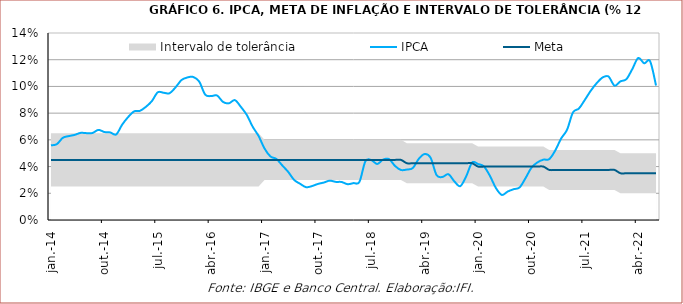
| Category | IPCA | Meta |
|---|---|---|
| 2014-01-01 | 0.056 | 0.045 |
| 2014-02-01 | 0.057 | 0.045 |
| 2014-03-01 | 0.062 | 0.045 |
| 2014-04-01 | 0.063 | 0.045 |
| 2014-05-01 | 0.064 | 0.045 |
| 2014-06-01 | 0.065 | 0.045 |
| 2014-07-01 | 0.065 | 0.045 |
| 2014-08-01 | 0.065 | 0.045 |
| 2014-09-01 | 0.067 | 0.045 |
| 2014-10-01 | 0.066 | 0.045 |
| 2014-11-01 | 0.066 | 0.045 |
| 2014-12-01 | 0.064 | 0.045 |
| 2015-01-01 | 0.071 | 0.045 |
| 2015-02-01 | 0.077 | 0.045 |
| 2015-03-01 | 0.081 | 0.045 |
| 2015-04-01 | 0.082 | 0.045 |
| 2015-05-01 | 0.085 | 0.045 |
| 2015-06-01 | 0.089 | 0.045 |
| 2015-07-01 | 0.096 | 0.045 |
| 2015-08-01 | 0.095 | 0.045 |
| 2015-09-01 | 0.095 | 0.045 |
| 2015-10-01 | 0.099 | 0.045 |
| 2015-11-01 | 0.105 | 0.045 |
| 2015-12-01 | 0.107 | 0.045 |
| 2016-01-01 | 0.107 | 0.045 |
| 2016-02-01 | 0.104 | 0.045 |
| 2016-03-01 | 0.094 | 0.045 |
| 2016-04-01 | 0.093 | 0.045 |
| 2016-05-01 | 0.093 | 0.045 |
| 2016-06-01 | 0.088 | 0.045 |
| 2016-07-01 | 0.087 | 0.045 |
| 2016-08-01 | 0.09 | 0.045 |
| 2016-09-01 | 0.085 | 0.045 |
| 2016-10-01 | 0.079 | 0.045 |
| 2016-11-01 | 0.07 | 0.045 |
| 2016-12-01 | 0.063 | 0.045 |
| 2017-01-01 | 0.054 | 0.045 |
| 2017-02-01 | 0.048 | 0.045 |
| 2017-03-01 | 0.046 | 0.045 |
| 2017-04-01 | 0.041 | 0.045 |
| 2017-05-01 | 0.036 | 0.045 |
| 2017-06-01 | 0.03 | 0.045 |
| 2017-07-01 | 0.027 | 0.045 |
| 2017-08-01 | 0.025 | 0.045 |
| 2017-09-01 | 0.025 | 0.045 |
| 2017-10-01 | 0.027 | 0.045 |
| 2017-11-01 | 0.028 | 0.045 |
| 2017-12-01 | 0.029 | 0.045 |
| 2018-01-01 | 0.029 | 0.045 |
| 2018-02-01 | 0.028 | 0.045 |
| 2018-03-01 | 0.027 | 0.045 |
| 2018-04-01 | 0.028 | 0.045 |
| 2018-05-01 | 0.029 | 0.045 |
| 2018-06-01 | 0.044 | 0.045 |
| 2018-07-01 | 0.045 | 0.045 |
| 2018-08-01 | 0.042 | 0.045 |
| 2018-09-01 | 0.045 | 0.045 |
| 2018-10-01 | 0.046 | 0.045 |
| 2018-11-01 | 0.04 | 0.045 |
| 2018-12-01 | 0.037 | 0.045 |
| 2019-01-01 | 0.038 | 0.042 |
| 2019-02-01 | 0.039 | 0.042 |
| 2019-03-01 | 0.046 | 0.042 |
| 2019-04-01 | 0.049 | 0.042 |
| 2019-05-01 | 0.047 | 0.042 |
| 2019-06-01 | 0.034 | 0.042 |
| 2019-07-01 | 0.032 | 0.042 |
| 2019-08-01 | 0.034 | 0.042 |
| 2019-09-01 | 0.029 | 0.042 |
| 2019-10-01 | 0.025 | 0.042 |
| 2019-11-01 | 0.033 | 0.042 |
| 2019-12-01 | 0.043 | 0.042 |
| 2020-01-01 | 0.042 | 0.04 |
| 2020-02-01 | 0.04 | 0.04 |
| 2020-03-01 | 0.033 | 0.04 |
| 2020-04-01 | 0.024 | 0.04 |
| 2020-05-01 | 0.019 | 0.04 |
| 2020-06-01 | 0.021 | 0.04 |
| 2020-07-01 | 0.023 | 0.04 |
| 2020-08-01 | 0.024 | 0.04 |
| 2020-09-01 | 0.031 | 0.04 |
| 2020-10-01 | 0.039 | 0.04 |
| 2020-11-01 | 0.043 | 0.04 |
| 2020-12-01 | 0.045 | 0.04 |
| 2021-01-01 | 0.046 | 0.038 |
| 2021-02-01 | 0.052 | 0.038 |
| 2021-03-01 | 0.061 | 0.038 |
| 2021-04-01 | 0.068 | 0.038 |
| 2021-05-01 | 0.081 | 0.038 |
| 2021-06-01 | 0.083 | 0.038 |
| 2021-07-01 | 0.09 | 0.038 |
| 2021-08-01 | 0.097 | 0.038 |
| 2021-09-01 | 0.102 | 0.038 |
| 2021-10-01 | 0.107 | 0.038 |
| 2021-11-01 | 0.107 | 0.038 |
| 2021-12-01 | 0.101 | 0.038 |
| 2022-01-01 | 0.104 | 0.035 |
| 2022-02-01 | 0.105 | 0.035 |
| 2022-03-01 | 0.113 | 0.035 |
| 2022-04-01 | 0.121 | 0.035 |
| 2022-05-01 | 0.117 | 0.035 |
| 2022-06-01 | 0.119 | 0.035 |
| 2022-07-01 | 0.101 | 0.035 |